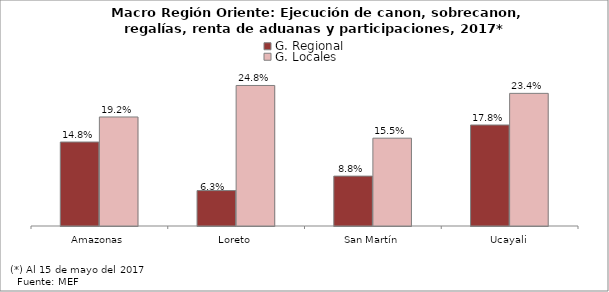
| Category | G. Regional | G. Locales |
|---|---|---|
| Amazonas | 0.148 | 0.192 |
| Loreto | 0.063 | 0.248 |
| San Martín | 0.088 | 0.155 |
| Ucayali | 0.178 | 0.234 |